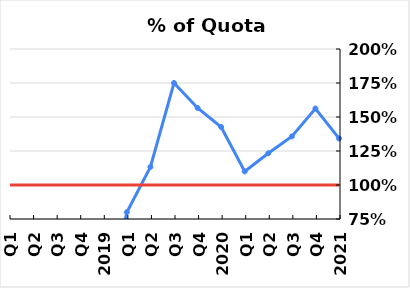
| Category | % of Annual Quota | Quota |
|---|---|---|
| 2021 | 1.342 | 1 |
| Q4 | 1.562 | 1 |
| Q3 | 1.357 | 1 |
| Q2 | 1.233 | 1 |
| Q1 | 1.1 | 1 |
| 2020 | 1.427 | 1 |
| Q4 | 1.567 | 1 |
| Q3 | 1.75 | 1 |
| Q2 | 1.133 | 1 |
| Q1 | 0.8 | 1 |
| 2019 | 0 | 1 |
| Q4 | 0 | 1 |
| Q3 | 0 | 1 |
| Q2 | 0 | 1 |
| Q1 | 0 | 1 |